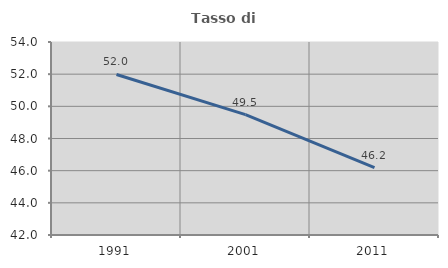
| Category | Tasso di occupazione   |
|---|---|
| 1991.0 | 51.98 |
| 2001.0 | 49.485 |
| 2011.0 | 46.193 |